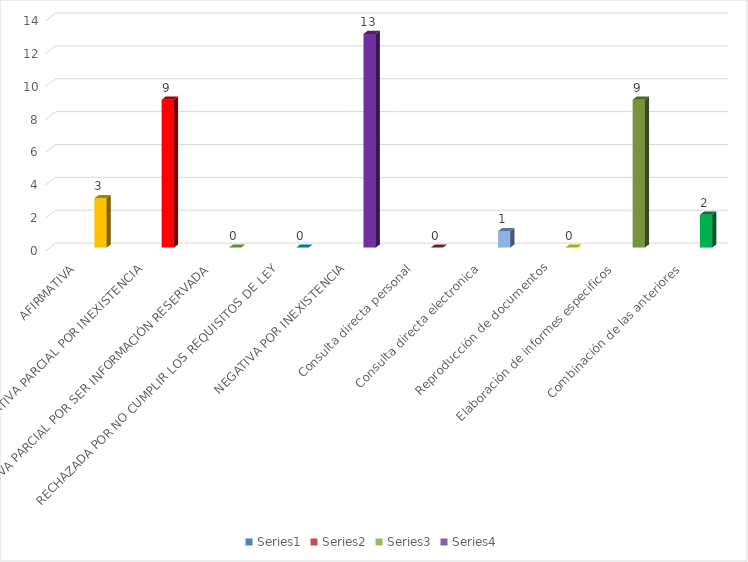
| Category | Series 0 | Series 1 | Series 2 | Series 3 |
|---|---|---|---|---|
| AFIRMATIVA |  |  |  | 3 |
| AFIRMATIVA PARCIAL POR INEXISTENCIA |  |  |  | 9 |
| AFIRMATIVA PARCIAL POR SER INFORMACIÓN RESERVADA |  |  |  | 0 |
| RECHAZADA POR NO CUMPLIR LOS REQUISITOS DE LEY |  |  |  | 0 |
| NEGATIVA POR INEXISTENCIA |  |  |  | 13 |
| Consulta directa personal |  |  |  | 0 |
| Consulta directa electronica |  |  |  | 1 |
| Reproducción de documentos |  |  |  | 0 |
| Elaboración de informes especificos |  |  |  | 9 |
| Combinación de las anteriores |  |  |  | 2 |